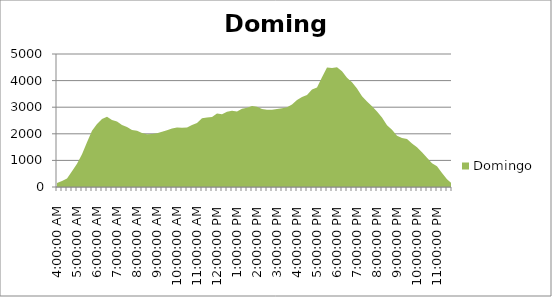
| Category | Domingo |
|---|---|
| 0.16666666666666663 | 151 |
| 0.1770833333333333 | 230 |
| 0.18749999999999994 | 324 |
| 0.1979166666666666 | 590 |
| 0.20833333333333326 | 872 |
| 0.21874999999999992 | 1235 |
| 0.22916666666666657 | 1679 |
| 0.23958333333333323 | 2112 |
| 0.2499999999999999 | 2368 |
| 0.2604166666666666 | 2557 |
| 0.27083333333333326 | 2644 |
| 0.28124999999999994 | 2521 |
| 0.29166666666666663 | 2460 |
| 0.3020833333333333 | 2333 |
| 0.3125 | 2257 |
| 0.3229166666666667 | 2147 |
| 0.33333333333333337 | 2110 |
| 0.34375000000000006 | 2029 |
| 0.35416666666666674 | 1981 |
| 0.3645833333333334 | 1988 |
| 0.3750000000000001 | 2021 |
| 0.3854166666666668 | 2074 |
| 0.3958333333333335 | 2135 |
| 0.40625000000000017 | 2197 |
| 0.41666666666666685 | 2237 |
| 0.42708333333333354 | 2230 |
| 0.4375000000000002 | 2240 |
| 0.4479166666666669 | 2331 |
| 0.4583333333333336 | 2406 |
| 0.4687500000000003 | 2582 |
| 0.47916666666666696 | 2615 |
| 0.48958333333333365 | 2633 |
| 0.5000000000000003 | 2761 |
| 0.510416666666667 | 2735 |
| 0.5208333333333336 | 2827 |
| 0.5312500000000002 | 2863 |
| 0.5416666666666669 | 2843 |
| 0.5520833333333335 | 2941 |
| 0.5625000000000001 | 2975 |
| 0.5729166666666667 | 3045 |
| 0.5833333333333334 | 3018 |
| 0.59375 | 2928 |
| 0.6041666666666666 | 2900 |
| 0.6145833333333333 | 2902 |
| 0.6249999999999999 | 2937 |
| 0.6354166666666665 | 2962 |
| 0.6458333333333331 | 3002 |
| 0.6562499999999998 | 3098 |
| 0.6666666666666664 | 3274 |
| 0.677083333333333 | 3381 |
| 0.6874999999999997 | 3459 |
| 0.6979166666666663 | 3665 |
| 0.7083333333333329 | 3742 |
| 0.7187499999999996 | 4126 |
| 0.7291666666666662 | 4495 |
| 0.7395833333333328 | 4478 |
| 0.7499999999999994 | 4504 |
| 0.7604166666666661 | 4352 |
| 0.7708333333333327 | 4109 |
| 0.7812499999999993 | 3935 |
| 0.791666666666666 | 3701 |
| 0.8020833333333326 | 3414 |
| 0.8124999999999992 | 3210 |
| 0.8229166666666659 | 3033 |
| 0.8333333333333325 | 2835 |
| 0.8437499999999991 | 2611 |
| 0.8541666666666657 | 2324 |
| 0.8645833333333324 | 2152 |
| 0.874999999999999 | 1927 |
| 0.8854166666666656 | 1840 |
| 0.8958333333333323 | 1801 |
| 0.9062499999999989 | 1639 |
| 0.9166666666666655 | 1496 |
| 0.9270833333333321 | 1311 |
| 0.9374999999999988 | 1103 |
| 0.9479166666666654 | 895 |
| 0.958333333333332 | 776 |
| 0.9687499999999987 | 525 |
| 0.9791666666666653 | 293 |
| 0.9895833333333319 | 130 |